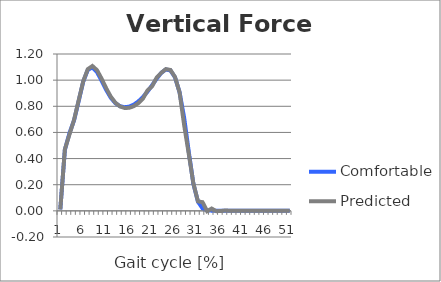
| Category | Comfortable | Predicted |
|---|---|---|
| 0 | 0.011 | 0.01 |
| 1 | 0.467 | 0.471 |
| 2 | 0.595 | 0.585 |
| 3 | 0.692 | 0.696 |
| 4 | 0.839 | 0.845 |
| 5 | 0.988 | 0.991 |
| 6 | 1.079 | 1.084 |
| 7 | 1.097 | 1.108 |
| 8 | 1.061 | 1.076 |
| 9 | 0.996 | 1.012 |
| 10 | 0.926 | 0.938 |
| 11 | 0.866 | 0.874 |
| 12 | 0.824 | 0.827 |
| 13 | 0.801 | 0.799 |
| 14 | 0.793 | 0.787 |
| 15 | 0.797 | 0.788 |
| 16 | 0.812 | 0.8 |
| 17 | 0.837 | 0.824 |
| 18 | 0.87 | 0.858 |
| 19 | 0.912 | 0.921 |
| 20 | 0.96 | 0.953 |
| 21 | 1.011 | 1.019 |
| 22 | 1.056 | 1.056 |
| 23 | 1.082 | 1.084 |
| 24 | 1.074 | 1.078 |
| 25 | 1.022 | 1.024 |
| 26 | 0.907 | 0.906 |
| 27 | 0.712 | 0.654 |
| 28 | 0.452 | 0.435 |
| 29 | 0.207 | 0.211 |
| 30 | 0.07 | 0.073 |
| 31 | 0.019 | 0.066 |
| 32 | 0.004 | -0.002 |
| 33 | 0.001 | 0.018 |
| 34 | 0.001 | -0.002 |
| 35 | 0.001 | -0.001 |
| 36 | 0.001 | 0.003 |
| 37 | 0.001 | 0 |
| 38 | 0.001 | 0.002 |
| 39 | 0.001 | 0.001 |
| 40 | 0.001 | 0.001 |
| 41 | 0.001 | 0.001 |
| 42 | 0.001 | 0.001 |
| 43 | 0.001 | 0.001 |
| 44 | 0.001 | 0.001 |
| 45 | 0.001 | 0.001 |
| 46 | 0.001 | 0.001 |
| 47 | 0.001 | 0.001 |
| 48 | 0.001 | 0.001 |
| 49 | 0 | 0.001 |
| 50 | 0 | 0 |